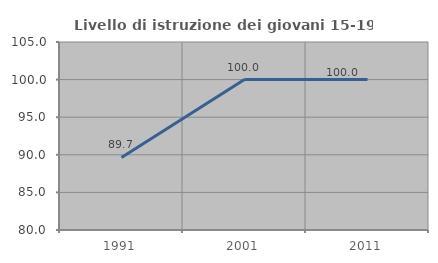
| Category | Livello di istruzione dei giovani 15-19 anni |
|---|---|
| 1991.0 | 89.655 |
| 2001.0 | 100 |
| 2011.0 | 100 |